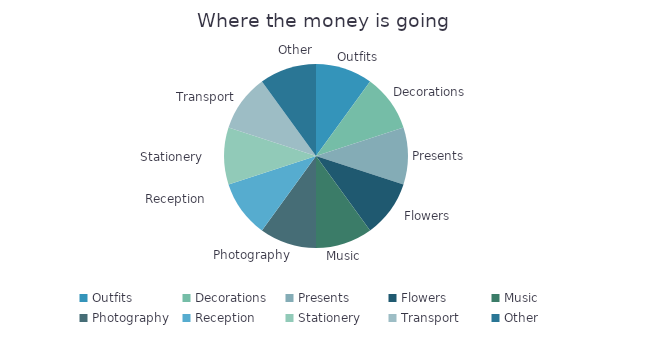
| Category | Amount |
|---|---|
| Outfits | 1 |
| Decorations | 1 |
| Presents | 1 |
| Flowers | 1 |
| Music | 1 |
| Photography | 1 |
| Reception | 1 |
| Stationery | 1 |
| Transport | 1 |
| Other | 1 |